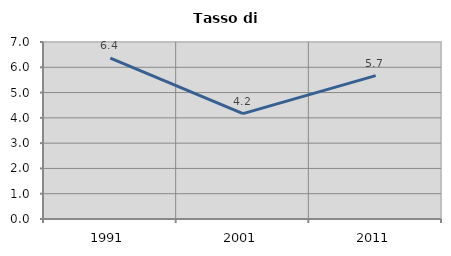
| Category | Tasso di disoccupazione   |
|---|---|
| 1991.0 | 6.361 |
| 2001.0 | 4.169 |
| 2011.0 | 5.67 |